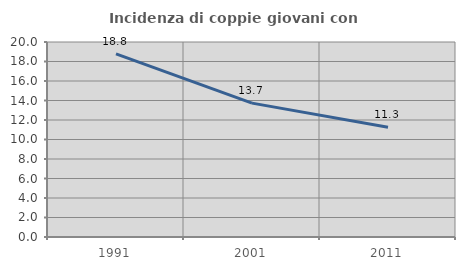
| Category | Incidenza di coppie giovani con figli |
|---|---|
| 1991.0 | 18.789 |
| 2001.0 | 13.731 |
| 2011.0 | 11.25 |